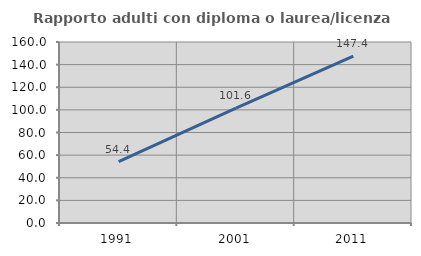
| Category | Rapporto adulti con diploma o laurea/licenza media  |
|---|---|
| 1991.0 | 54.355 |
| 2001.0 | 101.623 |
| 2011.0 | 147.423 |